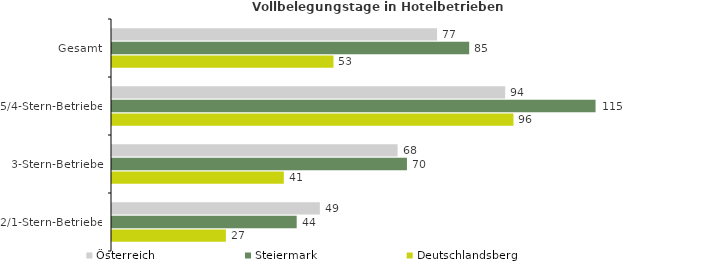
| Category | Österreich | Steiermark | Deutschlandsberg |
|---|---|---|---|
| Gesamt | 77.394 | 85.042 | 52.725 |
| 5/4-Stern-Betriebe | 93.608 | 115.133 | 95.586 |
| 3-Stern-Betriebe | 67.992 | 70.225 | 40.906 |
| 2/1-Stern-Betriebe | 49.488 | 43.973 | 27.113 |